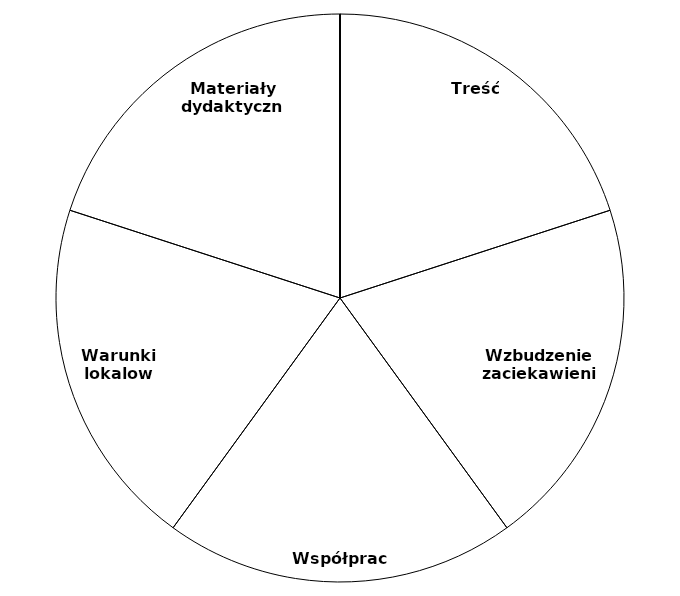
| Category | Series 0 |
|---|---|
| Treść | 20 |
| Wzbudzenie zaciekawienia | 20 |
| Współpraca | 20 |
| Warunki lokalowe | 20 |
| Materiały dydaktyczne | 20 |